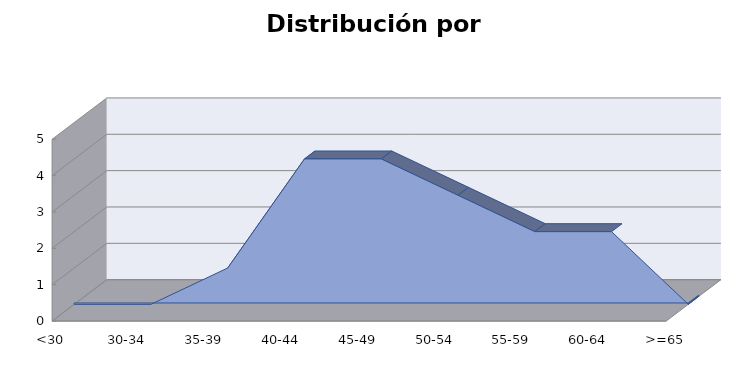
| Category | Series 1 |
|---|---|
| <30 | 0 |
| 30-34 | 0 |
| 35-39 | 1 |
| 40-44 | 4 |
| 45-49 | 4 |
| 50-54 | 3 |
| 55-59 | 2 |
| 60-64 | 2 |
| >=65 | 0 |